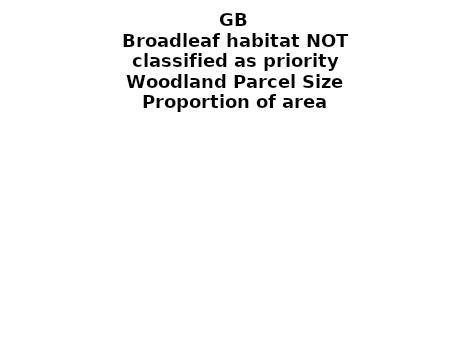
| Category | Broadleaf habitat NOT classified as priority |
|---|---|
| <5 ha | 0.237 |
| ≥5 and <10 ha | 0.1 |
| ≥10 and <15 ha | 0.064 |
| ≥15 and <20 ha | 0.026 |
| ≥20 and <25 ha | 0.026 |
| ≥25 and <30 ha | 0.019 |
| ≥30 and <35 ha | 0.016 |
| ≥35 and <40 ha | 0.012 |
| ≥40 and <45 ha | 0.01 |
| ≥45 and <50 ha | 0.015 |
| ≥50 and <60 ha | 0.025 |
| ≥60 and <70 ha | 0.022 |
| ≥70 and <80 ha | 0.012 |
| ≥80 and <90 ha | 0.021 |
| ≥90 and <100 ha | 0.026 |
| ≥100 and <150 ha | 0.056 |
| ≥150 and <200 ha | 0.03 |
| ≥200 ha | 0.283 |